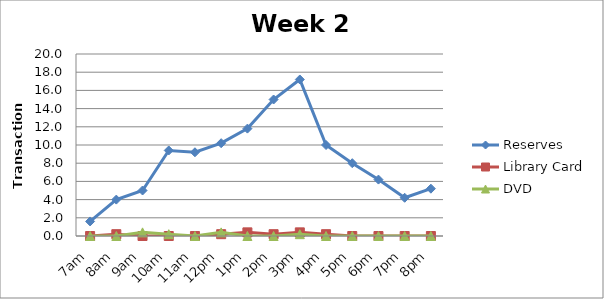
| Category | Reserves | Library Card | DVD |
|---|---|---|---|
| 7am | 1.6 | 0 | 0 |
| 8am | 4 | 0.2 | 0 |
| 9am | 5 | 0 | 0.4 |
| 10am | 9.4 | 0 | 0.2 |
| 11am | 9.2 | 0 | 0 |
| 12pm | 10.2 | 0.2 | 0.4 |
| 1pm | 11.8 | 0.4 | 0 |
| 2pm | 15 | 0.2 | 0 |
| 3pm | 17.2 | 0.4 | 0.2 |
| 4pm | 10 | 0.2 | 0 |
| 5pm | 8 | 0 | 0 |
| 6pm | 6.2 | 0 | 0 |
| 7pm | 4.2 | 0 | 0 |
| 8pm | 5.2 | 0 | 0 |